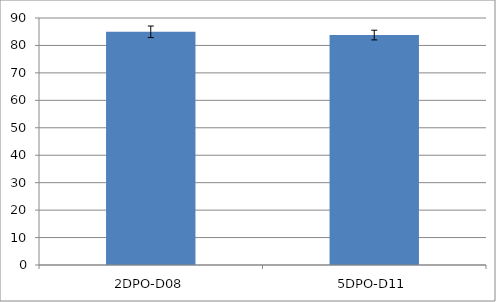
| Category | Series 0 |
|---|---|
| 2DPO-D08 | 84.973 |
| 5DPO-D11 | 83.783 |